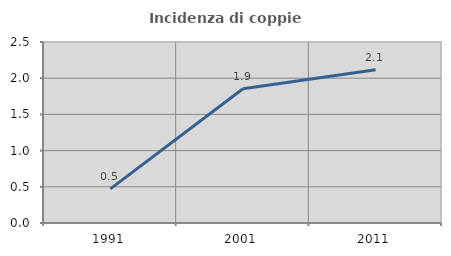
| Category | Incidenza di coppie miste |
|---|---|
| 1991.0 | 0.471 |
| 2001.0 | 1.853 |
| 2011.0 | 2.118 |